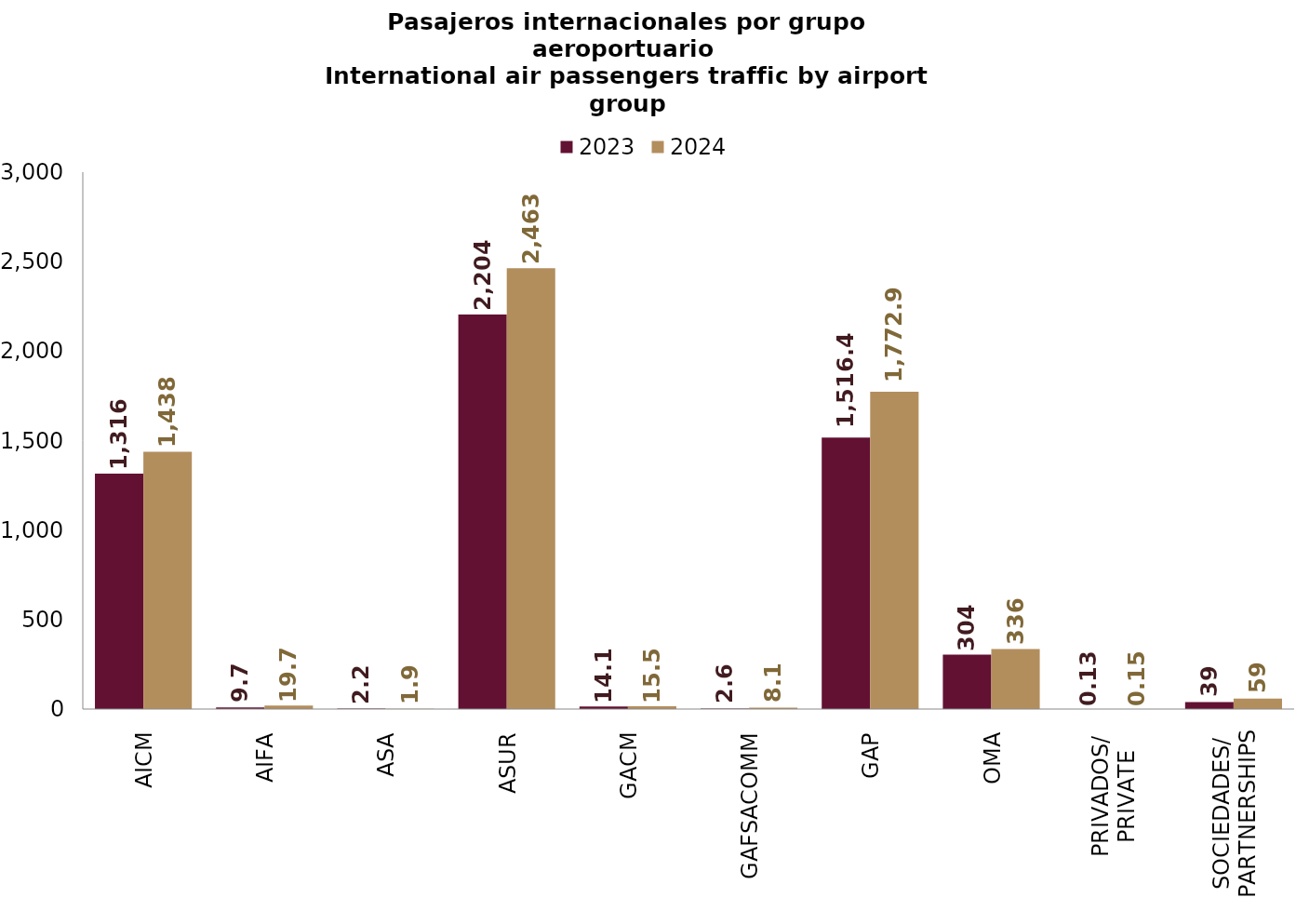
| Category | 2023 | 2024 |
|---|---|---|
| AICM | 1315.597 | 1437.728 |
| AIFA | 9.711 | 19.698 |
| ASA | 2.241 | 1.939 |
| ASUR | 2204.202 | 2463.102 |
| GACM | 14.093 | 15.515 |
| GAFSACOMM | 2.626 | 8.099 |
| GAP | 1516.399 | 1772.95 |
| OMA | 303.89 | 335.644 |
| PRIVADOS/
PRIVATE | 0.132 | 0.145 |
| SOCIEDADES/
PARTNERSHIPS | 38.733 | 58.695 |